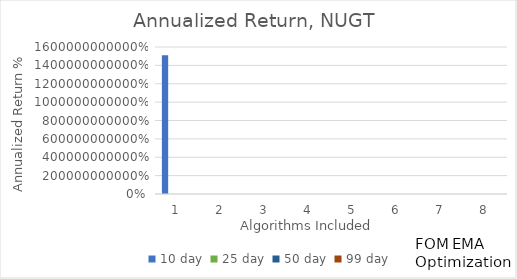
| Category | 10 day | 25 day | 50 day | 99 day |
|---|---|---|---|---|
| 1.0 | 15097764840.681 | 45369.728 | 3829.204 | 64.648 |
| 2.0 | 452753.774 | 908.628 | 236.577 | 17.293 |
| 3.0 | 172780.722 | 529.477 | 96.73 | 9.779 |
| 4.0 | 28632.422 | 287.627 | 47.792 | 5.508 |
| 5.0 | 1110.117 | 103.571 | 24.034 | 3.159 |
| 6.0 | 5027.472 | 112.154 | 25.736 | 8.036 |
| 7.0 | 1228.096 | 56.475 | 19.126 | 5.755 |
| 8.0 | 510.913 | 26.434 | 16.761 | 6.74 |